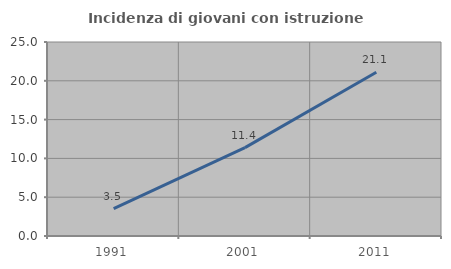
| Category | Incidenza di giovani con istruzione universitaria |
|---|---|
| 1991.0 | 3.537 |
| 2001.0 | 11.391 |
| 2011.0 | 21.105 |